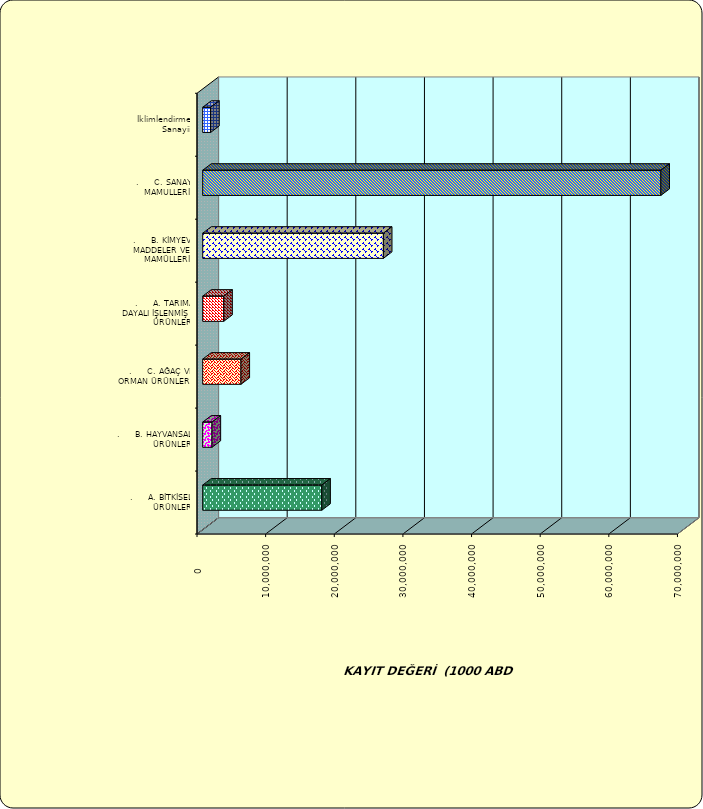
| Category | Series 0 |
|---|---|
| .     A. BİTKİSEL ÜRÜNLER | 17351531.719 |
| .     B. HAYVANSAL ÜRÜNLER | 1360275.564 |
| .     C. AĞAÇ VE ORMAN ÜRÜNLERİ | 5577999.74 |
| .     A. TARIMA DAYALI İŞLENMİŞ ÜRÜNLER | 3064892.121 |
| .     B. KİMYEVİ MADDELER VE MAMÜLLERİ | 26324581.822 |
| .     C. SANAYİ MAMULLERİ | 66753076.028 |
|  İklimlendirme Sanayii | 1154731.477 |